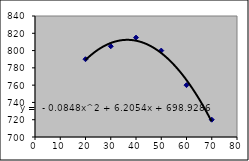
| Category | Series 0 |
|---|---|
| 20.0 | 790 |
| 30.0 | 805 |
| 40.0 | 815 |
| 50.0 | 800 |
| 60.0 | 760 |
| 70.0 | 720 |